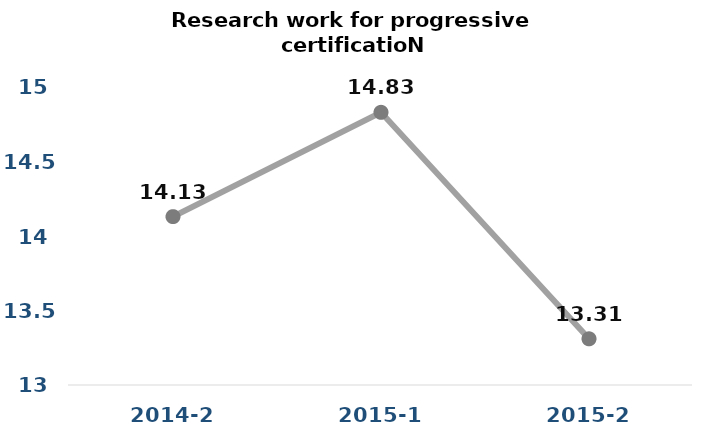
| Category | Series 0 |
|---|---|
| 2014-2 | 14.13 |
| 2015-1 | 14.83 |
| 2015-2 | 13.31 |